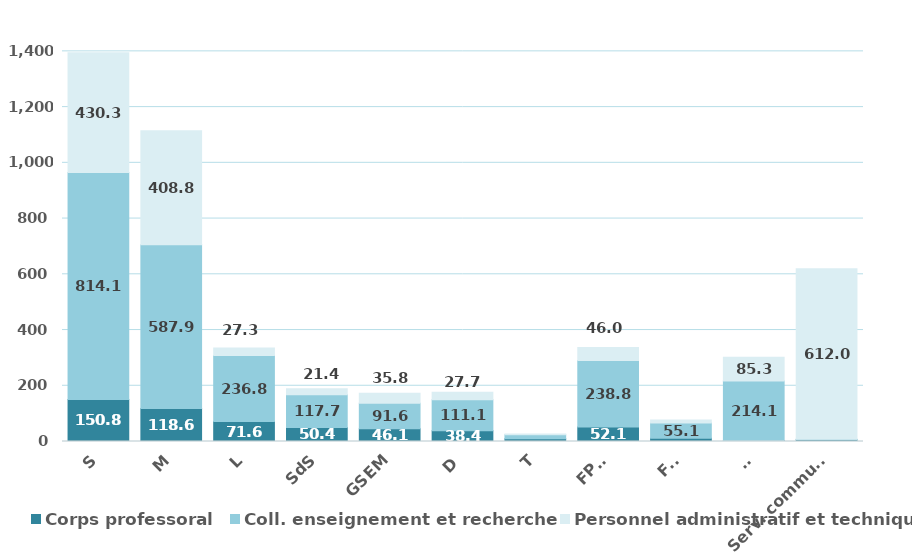
| Category | Corps professoral | Coll. enseignement et recherche | Personnel administratif et technique |
|---|---|---|---|
| S | 150.845 | 814.112 | 430.327 |
| M | 118.56 | 587.913 | 408.812 |
| L | 71.592 | 236.772 | 27.264 |
| SdS | 50.352 | 117.717 | 21.386 |
| GSEM | 46.09 | 91.556 | 35.808 |
| D | 38.366 | 111.052 | 27.724 |
| T | 9.917 | 14.61 | 2.825 |
| FPSE | 52.148 | 238.789 | 45.957 |
| FTI | 11.754 | 55.054 | 10.034 |
| CI | 3.2 | 214.135 | 85.281 |
| Serv. communs | 5.958 | 2.325 | 611.999 |